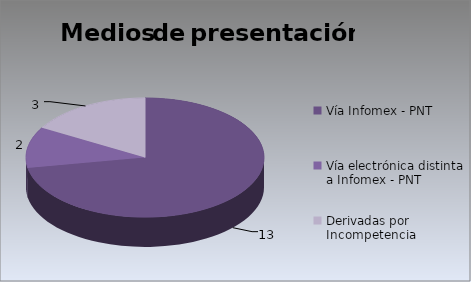
| Category | Series 0 |
|---|---|
| Vía Infomex - PNT | 13 |
| Vía electrónica distinta a Infomex - PNT | 2 |
| Derivadas por Incompetencia | 3 |